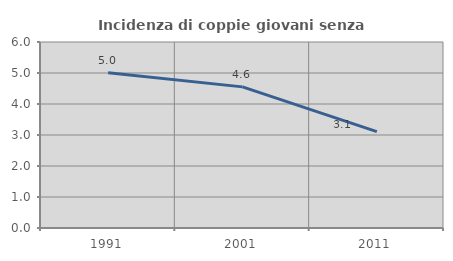
| Category | Incidenza di coppie giovani senza figli |
|---|---|
| 1991.0 | 5.007 |
| 2001.0 | 4.552 |
| 2011.0 | 3.11 |